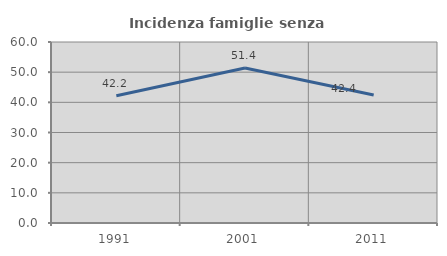
| Category | Incidenza famiglie senza nuclei |
|---|---|
| 1991.0 | 42.202 |
| 2001.0 | 51.402 |
| 2011.0 | 42.424 |